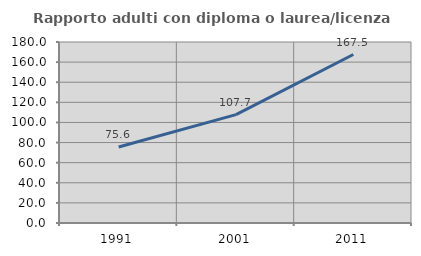
| Category | Rapporto adulti con diploma o laurea/licenza media  |
|---|---|
| 1991.0 | 75.573 |
| 2001.0 | 107.729 |
| 2011.0 | 167.532 |